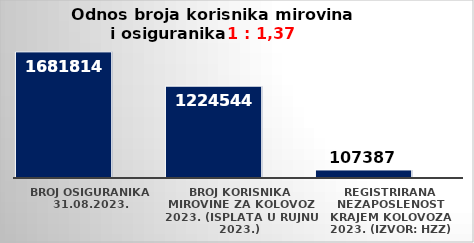
| Category | Series 0 | Series 1 |
|---|---|---|
| Broj osiguranika 31.08.2023. | 1681814 |  |
| Broj korisnika mirovine za kolovoz 2023. (isplata u rujnu 2023.) | 1224544 |  |
| Registrirana nezaposlenost krajem kolovoza 2023. (izvor: HZZ) | 107387 |  |